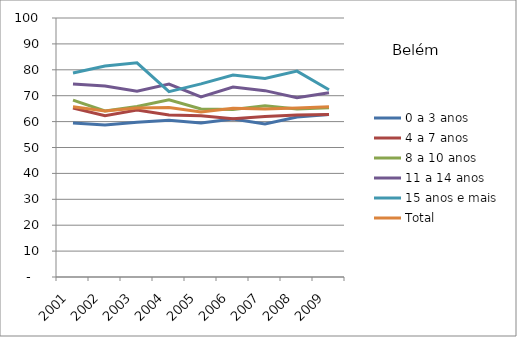
| Category | 0 a 3 anos | 4 a 7 anos | 8 a 10 anos | 11 a 14 anos | 15 anos e mais | Total |
|---|---|---|---|---|---|---|
| 2001.0 | 59.46 | 65.22 | 68.29 | 74.49 | 78.73 | 65.74 |
| 2002.0 | 58.68 | 62.23 | 64.11 | 73.78 | 81.43 | 64.14 |
| 2003.0 | 59.75 | 64.45 | 65.82 | 71.72 | 82.71 | 65.22 |
| 2004.0 | 60.54 | 62.52 | 68.42 | 74.46 | 71.54 | 65.43 |
| 2005.0 | 59.47 | 62.27 | 64.91 | 69.54 | 74.56 | 63.72 |
| 2006.0 | 61 | 61.07 | 64.71 | 73.33 | 77.99 | 65.15 |
| 2007.0 | 59.11 | 61.94 | 66.1 | 71.95 | 76.63 | 64.82 |
| 2008.0 | 61.75 | 62.57 | 64.83 | 69.19 | 79.48 | 65.29 |
| 2009.0 | 62.77 | 62.78 | 65.31 | 71.11 | 72.31 | 65.76 |